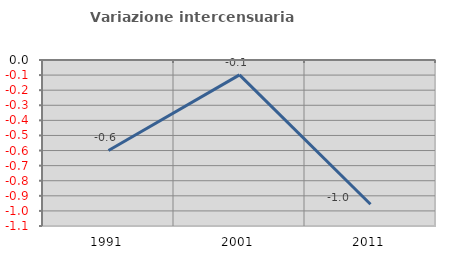
| Category | Variazione intercensuaria annua |
|---|---|
| 1991.0 | -0.6 |
| 2001.0 | -0.099 |
| 2011.0 | -0.956 |